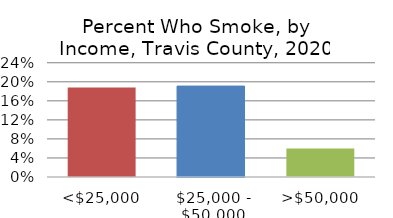
| Category | Series 0 |
|---|---|
| <$25,000 | 0.188 |
| $25,000 - $50,000 | 0.191 |
| >$50,000 | 0.06 |